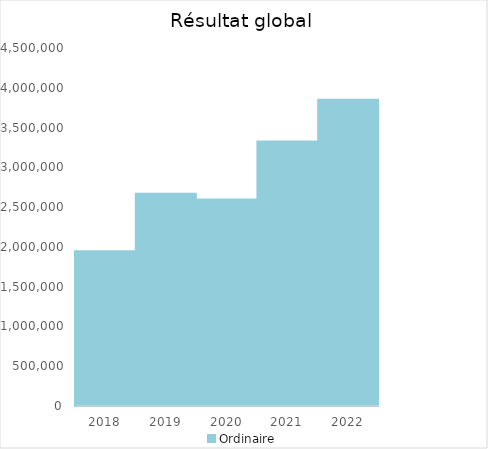
| Category |   | Ordinaire |    |
|---|---|---|---|
| 2018.0 |  | 1944204.52 |  |
| 2019.0 |  | 2666724.67 |  |
| 2020.0 |  | 2595942.33 |  |
| 2021.0 |  | 3324501.8 |  |
| 2022.0 |  | 3848845.81 |  |